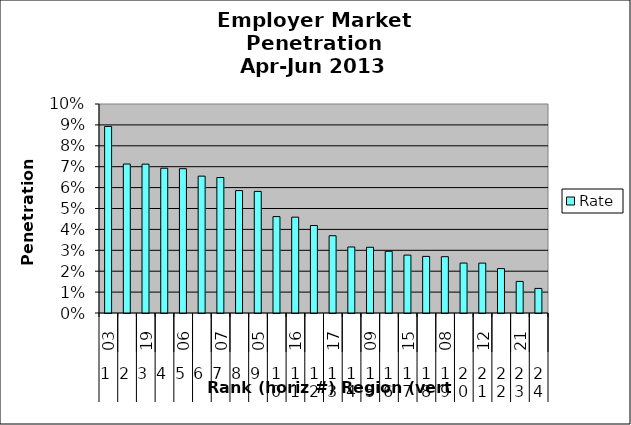
| Category | Rate |
|---|---|
| 0 | 0.089 |
| 1 | 0.071 |
| 2 | 0.071 |
| 3 | 0.069 |
| 4 | 0.069 |
| 5 | 0.065 |
| 6 | 0.065 |
| 7 | 0.059 |
| 8 | 0.058 |
| 9 | 0.046 |
| 10 | 0.046 |
| 11 | 0.042 |
| 12 | 0.037 |
| 13 | 0.032 |
| 14 | 0.031 |
| 15 | 0.03 |
| 16 | 0.028 |
| 17 | 0.027 |
| 18 | 0.027 |
| 19 | 0.024 |
| 20 | 0.024 |
| 21 | 0.021 |
| 22 | 0.015 |
| 23 | 0.012 |